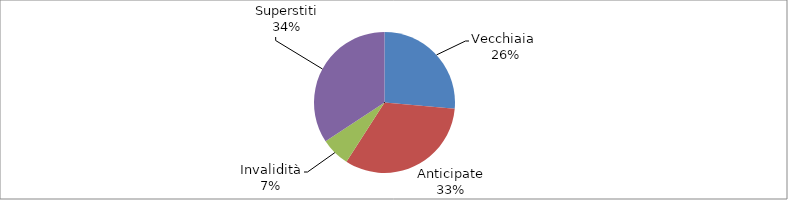
| Category | Series 0 |
|---|---|
| Vecchiaia  | 24341 |
| Anticipate | 30090 |
| Invalidità | 6164 |
| Superstiti | 31546 |